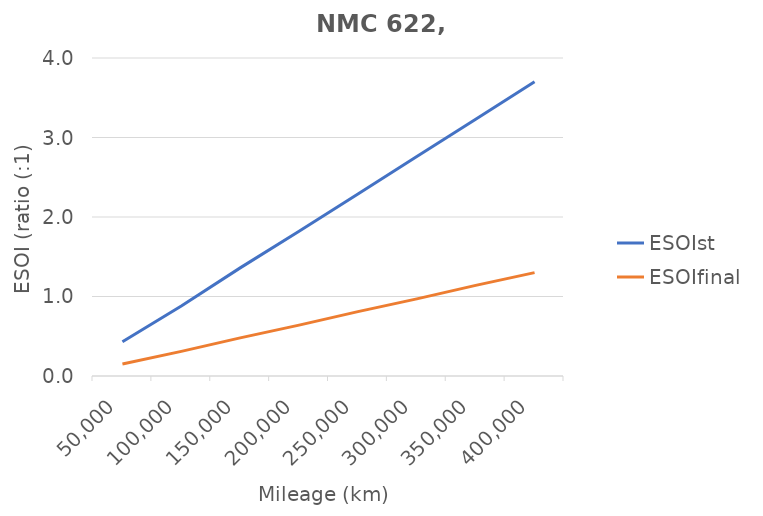
| Category | ESOIst | ESOIfinal |
|---|---|---|
| 50000.0 | 0.43 | 0.15 |
| 100000.0 | 0.88 | 0.31 |
| 150000.0 | 1.36 | 0.48 |
| 200000.0 | 1.82 | 0.64 |
| 250000.0 | 2.29 | 0.81 |
| 300000.0 | 2.76 | 0.97 |
| 350000.0 | 3.23 | 1.14 |
| 400000.0 | 3.7 | 1.3 |